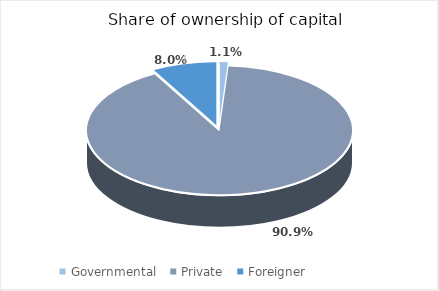
| Category |  النسبة  Percentage |
|---|---|
| Governmental | 0.011 |
| Private | 0.909 |
| Foreigner | 0.08 |